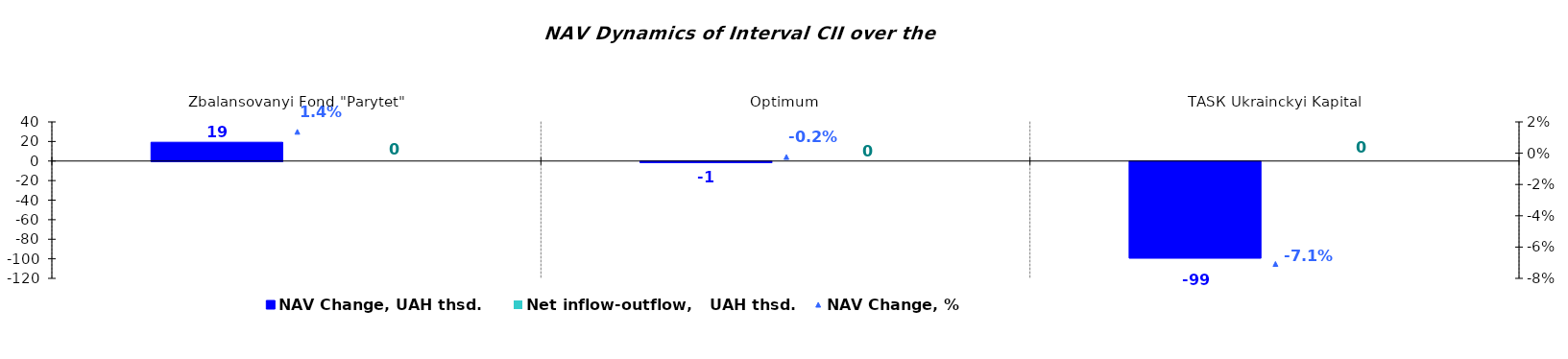
| Category | NAV Change, UAH thsd. | Net inflow-outflow,   UAH thsd. |
|---|---|---|
| Zbalansovanyi Fond "Parytet" | 19.202 | 0 |
| Оptimum | -1.127 | 0 |
| ТАSК Ukrainckyi Kapital | -98.759 | 0 |